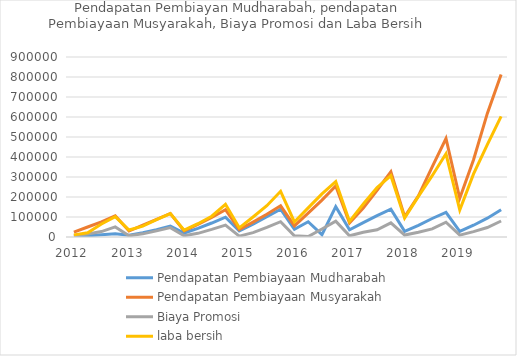
| Category | Pendapatan Pembiayaan Mudharabah | Pendapatan Pembiayaan Musyarakah | Biaya Promosi | laba bersih |
|---|---|---|---|---|
| 2012.0 | 2803 | 24219 | 7071 | 10588 |
| nan | 6153 | 49863 | 14942 | 21035 |
| nan | 10699 | 75835 | 27003 | 64888 |
| nan | 16708 | 106069 | 50420 | 101892 |
| 2013.0 | 8980 | 29707 | 6443 | 34997 |
| nan | 20821 | 58954 | 15761 | 54419 |
| nan | 36158 | 87916 | 30582 | 86657 |
| nan | 54685 | 117623 | 46928 | 117462 |
| 2014.0 | 19978 | 30327 | 6269 | 34503 |
| nan | 43132 | 63132 | 18349 | 66481 |
| nan | 69969 | 97602 | 37904 | 103931 |
| nan | 99232 | 136237 | 59684 | 163251 |
| 2015.0 | 30707 | 37084 | 4437 | 45668 |
| nan | 63709 | 74595 | 22054 | 99943 |
| nan | 101534 | 113642 | 48017 | 156619 |
| nan | 139302 | 155862 | 76357 | 228525 |
| 2016.0 | 38335 | 55280 | 5739 | 75178 |
| nan | 76167 | 119780 | 2176 | 145645 |
| nan | 11436 | 184386 | 40083 | 215231 |
| nan | 151781 | 254817 | 79459 | 277375 |
| 2017.0 | 36328 | 70254 | 5891 | 77638 |
| nan | 71508 | 144592 | 23741 | 165083 |
| nan | 107193 | 233535 | 35954 | 246602 |
| nan | 139156 | 325734 | 70747 | 306686 |
| 2018.0 | 28311 | 101043 | 9618 | 94479 |
| nan | 58611 | 205606 | 23587 | 202989 |
| nan | 92551 | 351117 | 40577 | 306613 |
| nan | 123307 | 492467 | 73820 | 416080 |
| 2019.0 | 27989 | 193935 | 9140 | 135348 |
| nan | 58877 | 386540 | 27081 | 315274 |
| nan | 93950 | 618084 | 47239 | 461958 |
| nan | 135969 | 812826 | 79941 | 603153 |